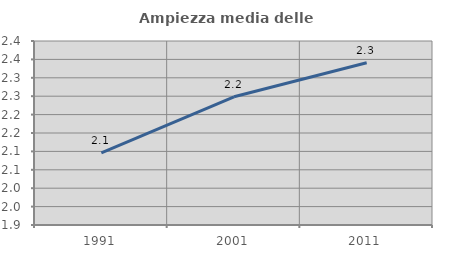
| Category | Ampiezza media delle famiglie |
|---|---|
| 1991.0 | 2.096 |
| 2001.0 | 2.248 |
| 2011.0 | 2.341 |